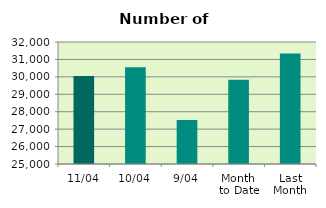
| Category | Series 0 |
|---|---|
| 11/04 | 30048 |
| 10/04 | 30554 |
| 9/04 | 27520 |
| Month 
to Date | 29827.556 |
| Last
Month | 31344.095 |